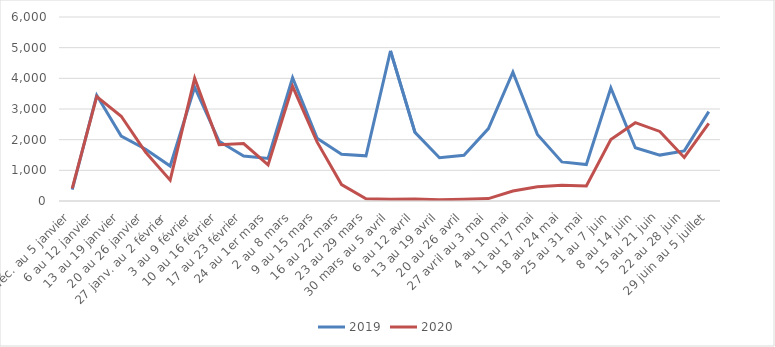
| Category | 2019 | 2020 |
|---|---|---|
| 30 déc. au 5 janvier | 369 | 411 |
| 6 au 12 janvier | 3446 | 3402 |
| 13 au 19 janvier | 2117 | 2765 |
| 20 au 26 janvier | 1689 | 1587 |
| 27 janv. au 2 février | 1140 | 678 |
| 3 au 9 février | 3711 | 4002 |
| 10 au 16 février | 1947 | 1835 |
| 17 au 23 février | 1464 | 1874 |
| 24 au 1er mars | 1389 | 1178 |
| 2 au 8 mars | 4019 | 3741 |
| 9 au 15 mars | 2049 | 1928 |
| 16 au 22 mars | 1525 | 536 |
| 23 au 29 mars | 1473 | 74 |
| 30 mars au 5 avril | 4896 | 61 |
| 6 au 12 avril | 2237 | 69 |
| 13 au 19 avril | 1410 | 40 |
| 20 au 26 avril | 1489 | 59 |
| 27 avril au 3 mai | 2361 | 79 |
| 4 au 10 mai | 4200 | 324 |
| 11 au 17 mai | 2172 | 463 |
| 18 au 24 mai | 1275 | 517 |
| 25 au 31 mai | 1190 | 488 |
| 1 au 7 juin | 3685 | 2004 |
| 8 au 14 juin | 1736 | 2554 |
| 15 au 21 juin | 1497 | 2268 |
| 22 au 28 juin | 1634 | 1420 |
| 29 juin au 5 juillet | 2913 | 2533 |